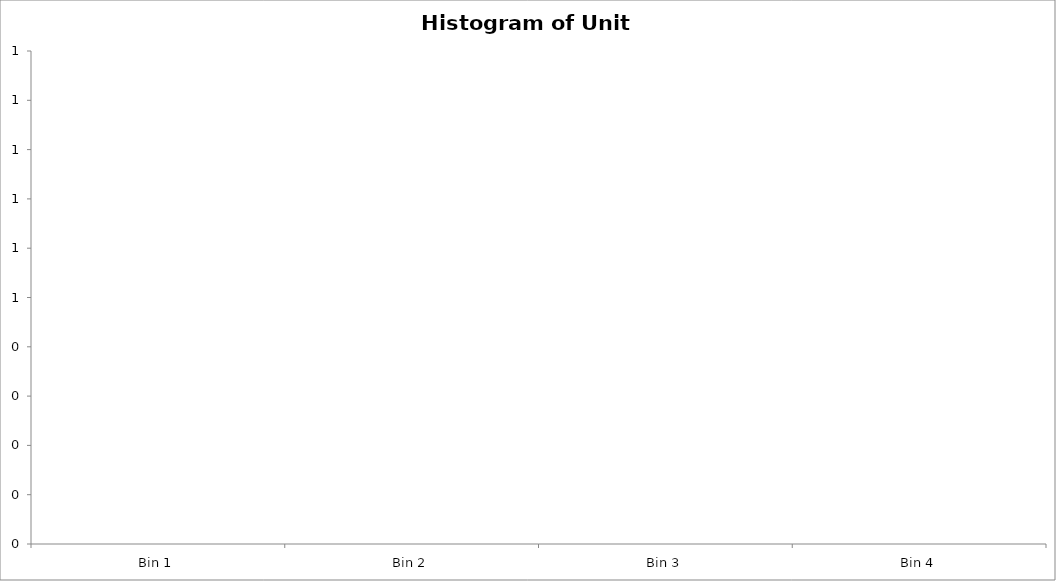
| Category | y-axis Frequency |
|---|---|
| Bin 1 | 0 |
| Bin 2 | 0 |
| Bin 3 | 0 |
| Bin 4 | 0 |